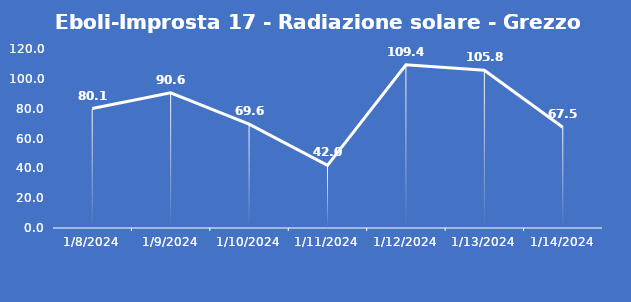
| Category | Eboli-Improsta 17 - Radiazione solare - Grezzo (W/m2) |
|---|---|
| 1/8/24 | 80.1 |
| 1/9/24 | 90.6 |
| 1/10/24 | 69.6 |
| 1/11/24 | 42 |
| 1/12/24 | 109.4 |
| 1/13/24 | 105.8 |
| 1/14/24 | 67.5 |